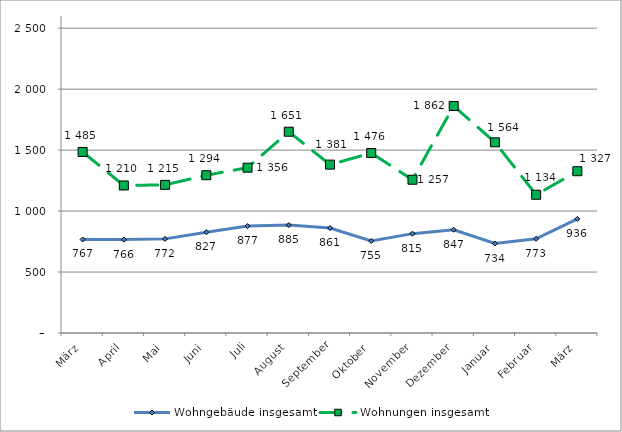
| Category | Wohngebäude insgesamt | Wohnungen insgesamt |
|---|---|---|
| März | 767 | 1485 |
| April | 766 | 1210 |
| Mai | 772 | 1215 |
| Juni | 827 | 1294 |
| Juli | 877 | 1356 |
| August | 885 | 1651 |
| September | 861 | 1381 |
| Oktober | 755 | 1476 |
| November | 815 | 1257 |
| Dezember | 847 | 1862 |
| Januar | 734 | 1564 |
| Februar | 773 | 1134 |
| März | 936 | 1327 |